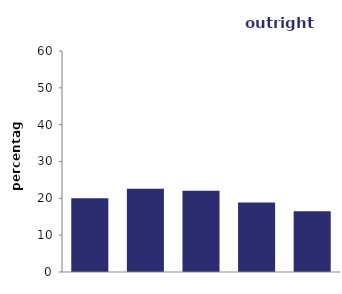
| Category | outright owners |
|---|---|
| quintile 1 (lowest) | 19.991 |
| quintile 2 | 22.585 |
| quintile 3 | 22.076 |
| quintile 4 | 18.848 |
| quintile 5 (highest) | 16.5 |